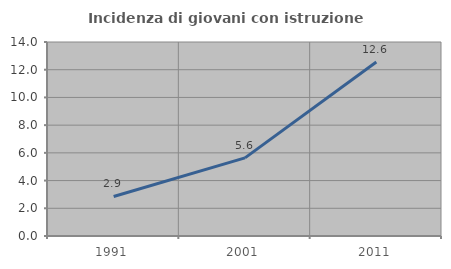
| Category | Incidenza di giovani con istruzione universitaria |
|---|---|
| 1991.0 | 2.852 |
| 2001.0 | 5.64 |
| 2011.0 | 12.563 |